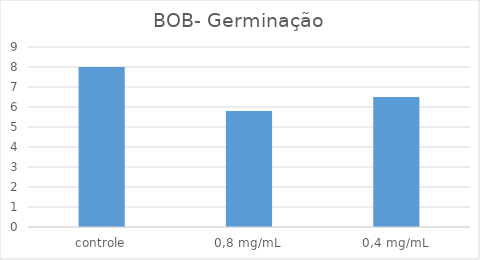
| Category | Series 0 |
|---|---|
| controle | 8 |
| 0,8 mg/mL | 5.8 |
| 0,4 mg/mL | 6.5 |